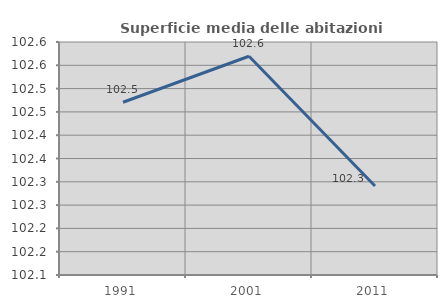
| Category | Superficie media delle abitazioni occupate |
|---|---|
| 1991.0 | 102.471 |
| 2001.0 | 102.569 |
| 2011.0 | 102.291 |